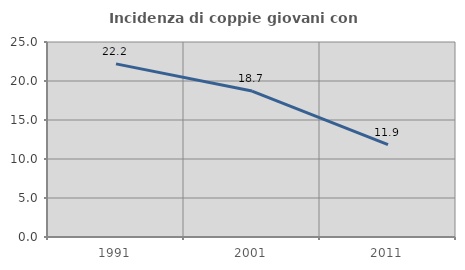
| Category | Incidenza di coppie giovani con figli |
|---|---|
| 1991.0 | 22.197 |
| 2001.0 | 18.713 |
| 2011.0 | 11.85 |